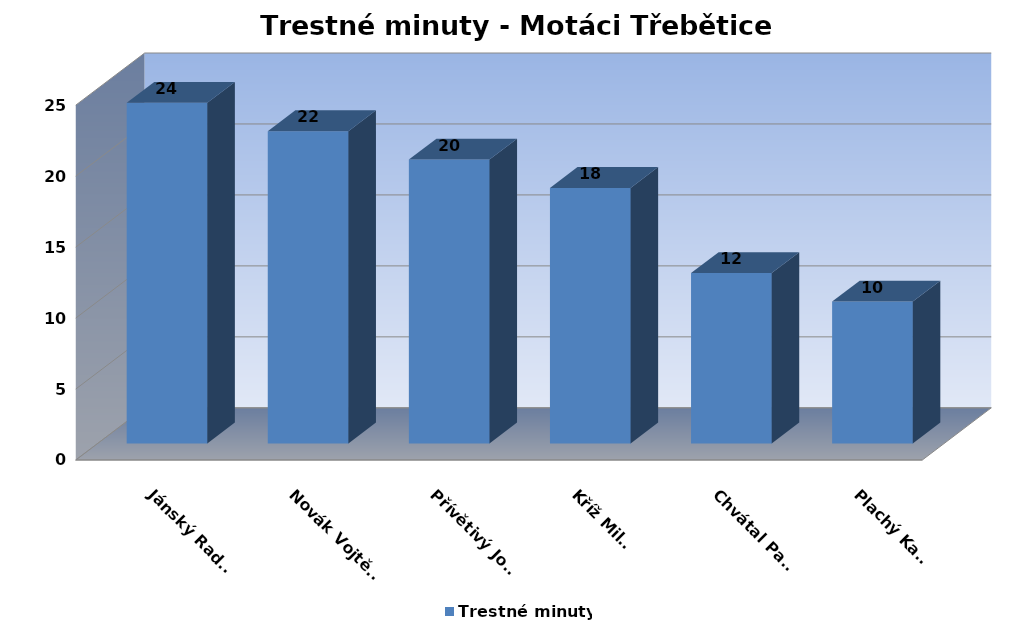
| Category | Trestné minuty |
|---|---|
| Jánský Radek | 24 |
| Novák Vojtěch | 22 |
| Přívětivý Josef | 20 |
| Kříž Milan | 18 |
| Chvátal Pavel | 12 |
| Plachý Karel | 10 |